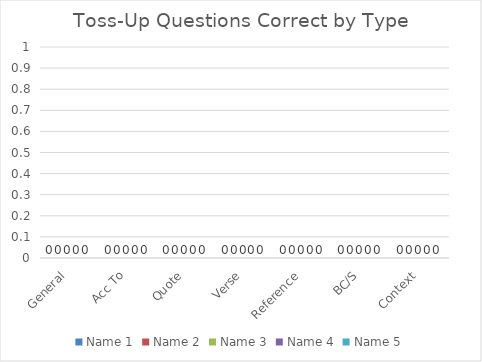
| Category | Name 1 | Name 2 | Name 3 | Name 4 | Name 5 |
|---|---|---|---|---|---|
| General | 0 | 0 | 0 | 0 | 0 |
| Acc To | 0 | 0 | 0 | 0 | 0 |
| Quote | 0 | 0 | 0 | 0 | 0 |
| Verse | 0 | 0 | 0 | 0 | 0 |
| Reference | 0 | 0 | 0 | 0 | 0 |
| BC/S | 0 | 0 | 0 | 0 | 0 |
| Context | 0 | 0 | 0 | 0 | 0 |